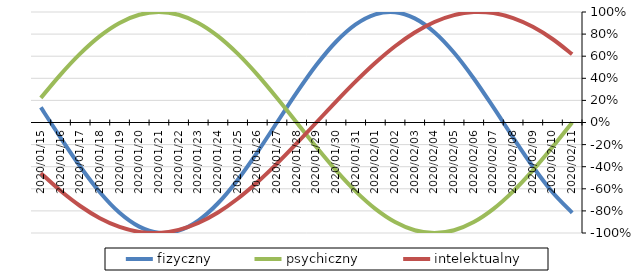
| Category | fizyczny | psychiczny | intelektualny |
|---|---|---|---|
| 2020-01-15 | 0.136 | 0.223 | -0.458 |
| 2020-01-16 | -0.136 | 0.434 | -0.618 |
| 2020-01-17 | -0.398 | 0.623 | -0.756 |
| 2020-01-18 | -0.631 | 0.782 | -0.866 |
| 2020-01-19 | -0.817 | 0.901 | -0.945 |
| 2020-01-20 | -0.942 | 0.975 | -0.99 |
| 2020-01-21 | -0.998 | 1 | -0.999 |
| 2020-01-22 | -0.979 | 0.975 | -0.972 |
| 2020-01-23 | -0.888 | 0.901 | -0.91 |
| 2020-01-24 | -0.731 | 0.782 | -0.815 |
| 2020-01-25 | -0.52 | 0.623 | -0.69 |
| 2020-01-26 | -0.27 | 0.434 | -0.541 |
| 2020-01-27 | 0 | 0.223 | -0.372 |
| 2020-01-28 | 0.27 | 0 | -0.189 |
| 2020-01-29 | 0.52 | -0.223 | 0 |
| 2020-01-30 | 0.731 | -0.434 | 0.189 |
| 2020-01-31 | 0.888 | -0.623 | 0.372 |
| 2020-02-01 | 0.979 | -0.782 | 0.541 |
| 2020-02-02 | 0.998 | -0.901 | 0.69 |
| 2020-02-03 | 0.942 | -0.975 | 0.815 |
| 2020-02-04 | 0.817 | -1 | 0.91 |
| 2020-02-05 | 0.631 | -0.975 | 0.972 |
| 2020-02-06 | 0.398 | -0.901 | 0.999 |
| 2020-02-07 | 0.136 | -0.782 | 0.99 |
| 2020-02-08 | -0.136 | -0.623 | 0.945 |
| 2020-02-09 | -0.398 | -0.434 | 0.866 |
| 2020-02-10 | -0.631 | -0.223 | 0.756 |
| 2020-02-11 | -0.817 | 0 | 0.618 |